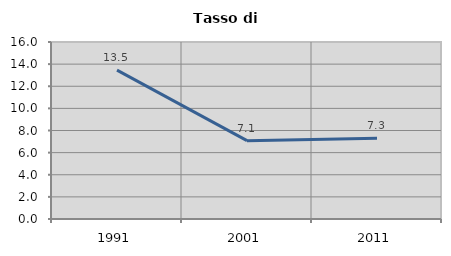
| Category | Tasso di disoccupazione   |
|---|---|
| 1991.0 | 13.453 |
| 2001.0 | 7.08 |
| 2011.0 | 7.308 |